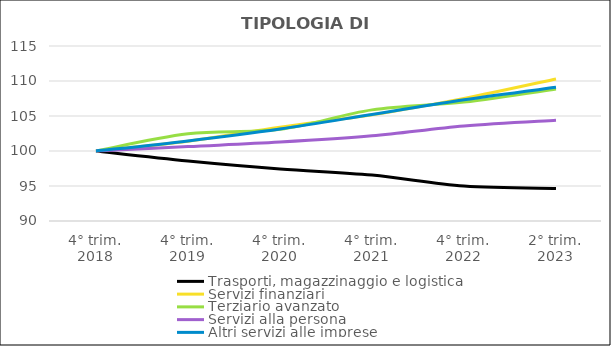
| Category | Trasporti, magazzinaggio e logistica | Servizi finanziari | Terziario avanzato  | Servizi alla persona  | Altri servizi alle imprese |
|---|---|---|---|---|---|
| 4° trim.
2018 | 100 | 100 | 100 | 100 | 100 |
| 4° trim.
2019 | 98.572 | 101.406 | 102.451 | 100.636 | 101.444 |
| 4° trim.
2020 | 97.437 | 103.4 | 103.096 | 101.272 | 103.149 |
| 4° trim.
2021 | 96.558 | 105.165 | 105.877 | 102.165 | 105.221 |
| 4° trim.
2022 | 94.984 | 107.519 | 106.992 | 103.573 | 107.328 |
| 2° trim.
2023 | 94.654 | 110.297 | 108.847 | 104.39 | 109.092 |